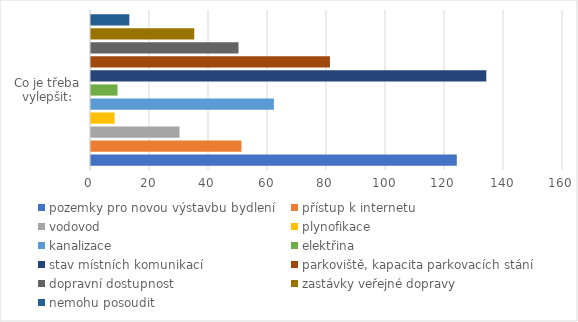
| Category | pozemky pro novou výstavbu bydlení | přístup k internetu | vodovod | plynofikace | kanalizace | elektřina | stav místních komunikací | parkoviště, kapacita parkovacích stání | dopravní dostupnost | zastávky veřejné dopravy | nemohu posoudit |
|---|---|---|---|---|---|---|---|---|---|---|---|
| 0 | 124 | 51 | 30 | 8 | 62 | 9 | 134 | 81 | 50 | 35 | 13 |